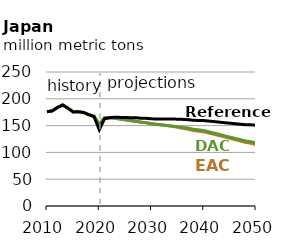
| Category | EAC | DAC | Reference |
|---|---|---|---|
| 2010.0 | 175.914 | 175.914 | 175.914 |
| 2011.0 | 177.38 | 177.38 | 177.38 |
| 2012.0 | 183.856 | 183.856 | 183.856 |
| 2013.0 | 188.43 | 188.43 | 188.43 |
| 2014.0 | 182.612 | 182.612 | 182.612 |
| 2015.0 | 175.57 | 175.57 | 175.57 |
| 2016.0 | 175.688 | 175.688 | 175.688 |
| 2017.0 | 174.571 | 174.571 | 174.571 |
| 2018.0 | 170.379 | 170.379 | 170.379 |
| 2019.0 | 167.805 | 167.805 | 166.603 |
| 2020.0 | 152.457 | 152.457 | 142.318 |
| 2021.0 | 164.731 | 164.73 | 162.674 |
| 2022.0 | 164.599 | 164.575 | 164.797 |
| 2023.0 | 163.787 | 163.756 | 165.716 |
| 2024.0 | 162.223 | 162.186 | 165.282 |
| 2025.0 | 160.771 | 160.725 | 165.104 |
| 2026.0 | 159.187 | 159.132 | 164.716 |
| 2027.0 | 158.278 | 158.21 | 164.665 |
| 2028.0 | 156.361 | 156.278 | 163.692 |
| 2029.0 | 155.412 | 155.312 | 163.56 |
| 2030.0 | 153.462 | 153.248 | 162.576 |
| 2031.0 | 152.488 | 152.181 | 162.448 |
| 2032.0 | 151.412 | 151.05 | 162.308 |
| 2033.0 | 149.963 | 150.025 | 162.298 |
| 2034.0 | 148.648 | 148.93 | 162.229 |
| 2035.0 | 147.022 | 147.699 | 162.009 |
| 2036.0 | 144.939 | 146.552 | 161.593 |
| 2037.0 | 143.315 | 145.37 | 161.106 |
| 2038.0 | 140.94 | 143.135 | 159.856 |
| 2039.0 | 139.69 | 142.075 | 159.631 |
| 2040.0 | 138.416 | 140.837 | 159.393 |
| 2041.0 | 136.086 | 138.477 | 158.4 |
| 2042.0 | 133.726 | 136.049 | 157.427 |
| 2043.0 | 131.309 | 133.515 | 156.417 |
| 2044.0 | 128.855 | 130.892 | 155.42 |
| 2045.0 | 126.379 | 128.556 | 154.466 |
| 2046.0 | 123.862 | 126.185 | 153.524 |
| 2047.0 | 121.293 | 123.773 | 152.572 |
| 2048.0 | 118.69 | 121.335 | 151.644 |
| 2049.0 | 117.186 | 120.054 | 151.542 |
| 2050.0 | 114.483 | 117.541 | 150.603 |